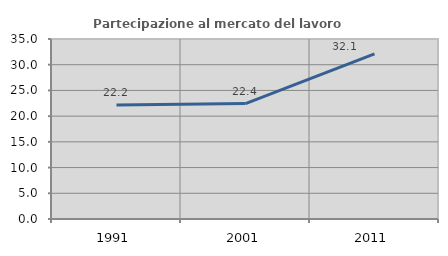
| Category | Partecipazione al mercato del lavoro  femminile |
|---|---|
| 1991.0 | 22.159 |
| 2001.0 | 22.436 |
| 2011.0 | 32.117 |